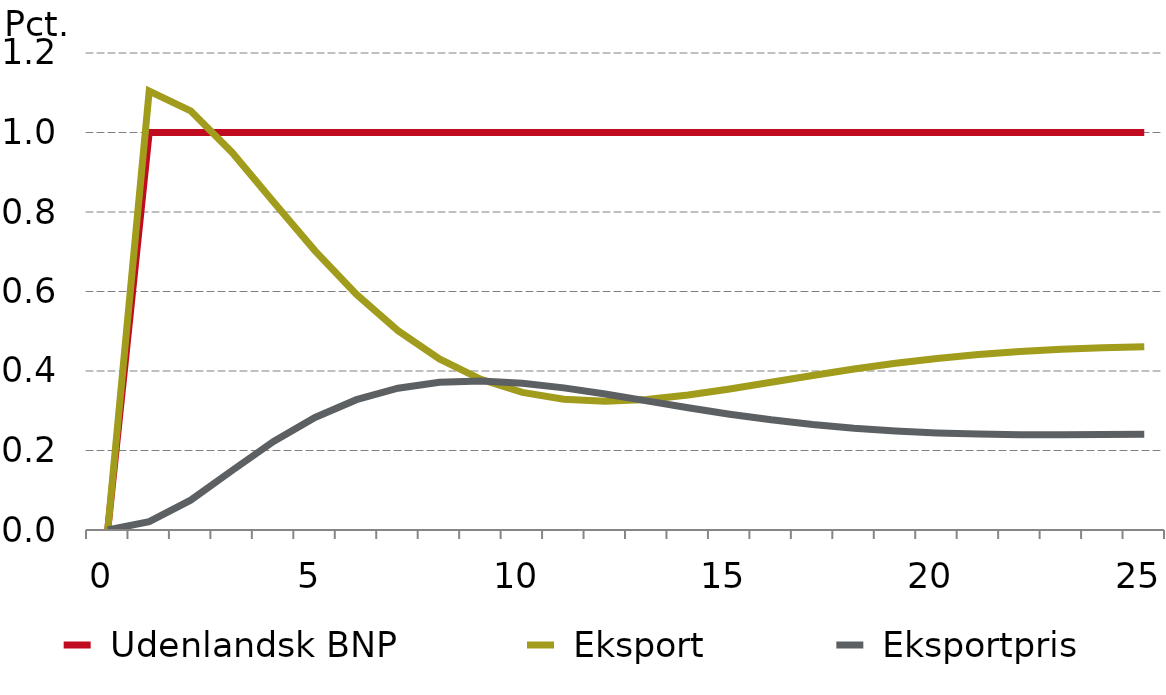
| Category |  Udenlandsk BNP |  Eksport |  Eksportpris |
|---|---|---|---|
| 0.0 | 0 | 0 | 0 |
| nan | 1 | 1.104 | 0.021 |
| nan | 1 | 1.054 | 0.075 |
| nan | 1 | 0.95 | 0.15 |
| nan | 1 | 0.825 | 0.223 |
| 5.0 | 1 | 0.702 | 0.283 |
| nan | 1 | 0.593 | 0.328 |
| nan | 1 | 0.501 | 0.357 |
| nan | 1 | 0.43 | 0.372 |
| nan | 1 | 0.379 | 0.375 |
| 10.0 | 1 | 0.346 | 0.369 |
| nan | 1 | 0.329 | 0.358 |
| nan | 1 | 0.324 | 0.342 |
| nan | 1 | 0.328 | 0.325 |
| nan | 1 | 0.34 | 0.307 |
| 15.0 | 1 | 0.355 | 0.291 |
| nan | 1 | 0.372 | 0.277 |
| nan | 1 | 0.389 | 0.265 |
| nan | 1 | 0.405 | 0.256 |
| nan | 1 | 0.419 | 0.249 |
| 20.0 | 1 | 0.432 | 0.244 |
| nan | 1 | 0.442 | 0.241 |
| nan | 1 | 0.449 | 0.24 |
| nan | 1 | 0.455 | 0.24 |
| nan | 1 | 0.459 | 0.24 |
| 25.0 | 1 | 0.461 | 0.241 |